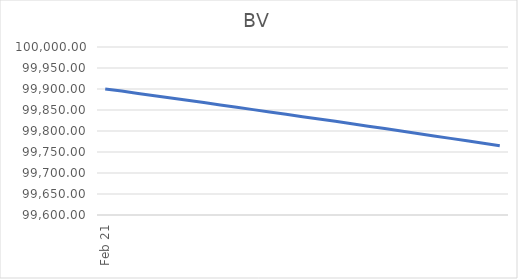
| Category | BV |
|---|---|
| 2021-02-01 | 99900 |
| 2021-03-01 | 99894.99 |
| 2021-04-01 | 99889.5 |
| 2021-05-01 | 99884.14 |
| 2021-06-01 | 99878.61 |
| 2021-07-01 | 99873.22 |
| 2021-08-01 | 99867.64 |
| 2021-09-01 | 99862.04 |
| 2021-10-01 | 99856.57 |
| 2021-11-01 | 99850.92 |
| 2021-12-01 | 99845.41 |
| 2022-01-01 | 99839.71 |
| 2022-02-01 | 99833.99 |
| 2022-03-01 | 99828.73 |
| 2022-04-01 | 99822.96 |
| 2022-05-01 | 99817.33 |
| 2022-06-01 | 99811.52 |
| 2022-07-01 | 99805.85 |
| 2022-08-01 | 99799.99 |
| 2022-09-01 | 99794.1 |
| 2022-10-01 | 99788.35 |
| 2022-11-01 | 99782.41 |
| 2022-12-01 | 99776.63 |
| 2023-01-01 | 99770.65 |
| 2023-02-01 | 99764.64 |